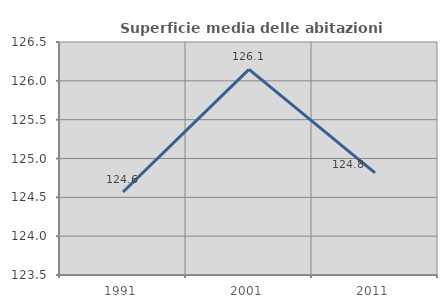
| Category | Superficie media delle abitazioni occupate |
|---|---|
| 1991.0 | 124.569 |
| 2001.0 | 126.148 |
| 2011.0 | 124.815 |